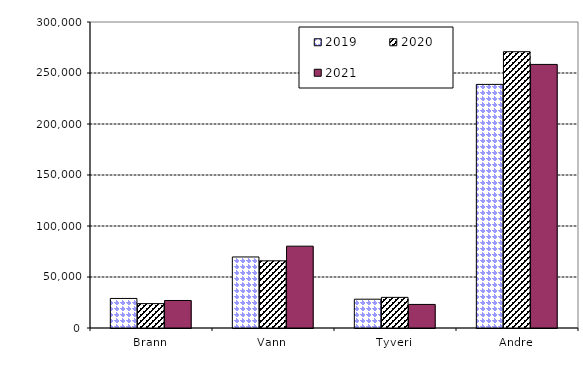
| Category | 2019 | 2020 | 2021 |
|---|---|---|---|
| Brann | 28972.993 | 23897.272 | 26988.177 |
| Vann | 69652.37 | 65851.136 | 80225.35 |
| Tyveri | 28235.61 | 30032.017 | 23104.743 |
| Andre | 238829.967 | 270870.856 | 258418.53 |